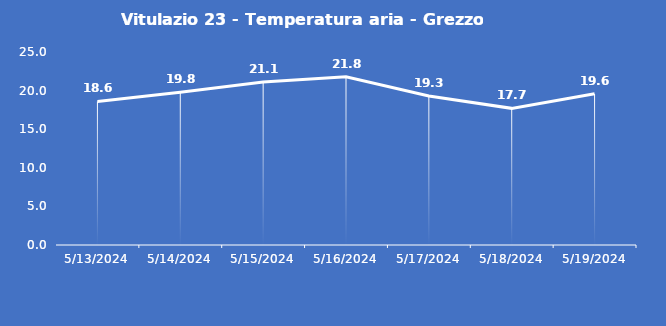
| Category | Vitulazio 23 - Temperatura aria - Grezzo (°C) |
|---|---|
| 5/13/24 | 18.6 |
| 5/14/24 | 19.8 |
| 5/15/24 | 21.1 |
| 5/16/24 | 21.8 |
| 5/17/24 | 19.3 |
| 5/18/24 | 17.7 |
| 5/19/24 | 19.6 |